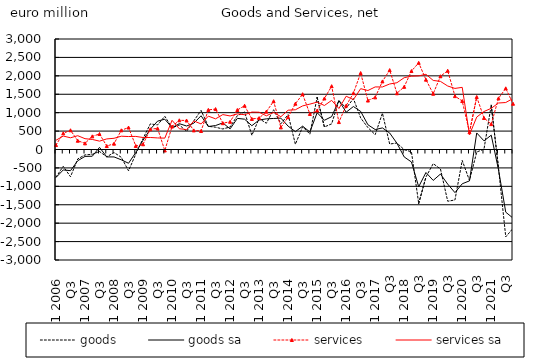
| Category | goods | goods sa | services | services sa |
|---|---|---|---|---|
| Q1 2006 | -748.738 | -760.381 | 121.483 | 251.205 |
| Q2  | -457.13 | -554.307 | 439.864 | 365.201 |
| Q3  | -738.853 | -574.648 | 522.467 | 318.056 |
| Q4  | -255.445 | -304.223 | 238.126 | 374.832 |
| Q1 2007 | -146.668 | -187.906 | 167.038 | 293.831 |
| Q2  | -131.911 | -182.819 | 357.186 | 272.807 |
| Q3  | -54.109 | 58.105 | 420.496 | 227.367 |
| Q4  | -199.637 | -201.16 | 93.568 | 287.261 |
| Q1 2008 | -81.525 | -201.568 | 157.959 | 304.399 |
| Q2  | -212.023 | -280.312 | 520.771 | 360.694 |
| Q3  | -578.77 | -373.701 | 596.514 | 351.851 |
| Q4  | -123.601 | -80.755 | 96.329 | 355.462 |
| Q1 2009 | 296.348 | 253.201 | 142.739 | 325.169 |
| Q2  | 694.756 | 549.918 | 550.029 | 326.335 |
| Q3  | 667.255 | 769.571 | 573.279 | 314.305 |
| Q4  | 903.09 | 822.598 | -26.654 | 308.787 |
| Q1 2010 | 586.597 | 591.472 | 623.552 | 792.014 |
| Q2  | 666.429 | 701.182 | 792.951 | 564 |
| Q3  | 493.636 | 638.366 | 787.632 | 540.513 |
| Q4  | 777.694 | 714.006 | 518.483 | 775.29 |
| Q1 2011 | 1061.507 | 915.73 | 502.35 | 694.013 |
| Q2  | 629.698 | 623.226 | 1075.429 | 905.614 |
| Q3  | 604.538 | 651.03 | 1097.459 | 832.543 |
| Q4  | 557.456 | 722.274 | 714.594 | 947.695 |
| Q1 2012 | 611.21 | 559.59 | 752.437 | 910.64 |
| Q2  | 919.092 | 845.407 | 1073.312 | 966.636 |
| Q3  | 1016.702 | 822.878 | 1187.924 | 944.221 |
| Q4  | 385.656 | 646.075 | 829.883 | 1016.22 |
| Q1 2013 | 840.395 | 800.399 | 852.505 | 1012.325 |
| Q2  | 713.466 | 832.137 | 1027.945 | 914.969 |
| Q3  | 1078.77 | 842.679 | 1310.987 | 1006.77 |
| Q4  | 698.464 | 851.746 | 600.682 | 890.362 |
| Q1 2014 | 946.76 | 633.575 | 878.495 | 1066.539 |
| Q2  | 141.9 | 485.284 | 1243.117 | 1078.867 |
| Q3  | 617.394 | 633.753 | 1501.271 | 1183.689 |
| Q4  | 419.131 | 475.713 | 964.238 | 1232.092 |
| Q1 2015 | 1413.787 | 999.099 | 1057.718 | 1285.853 |
| Q2  | 611.78 | 793.43 | 1385.478 | 1194.489 |
| Q3  | 696.421 | 891.336 | 1719.273 | 1333.868 |
| Q4 | 1329.692 | 1329.569 | 744.866 | 1113.038 |
| Q1 2016 | 1124.371 | 1012.436 | 1191.804 | 1446.322 |
| Q2  | 1382.591 | 1166.267 | 1528.848 | 1355.096 |
| Q3  | 856.491 | 1034.344 | 2075.772 | 1651.624 |
| Q4 | 594.804 | 672.006 | 1329.107 | 1601.343 |
| Q1 2017 | 401.951 | 541.411 | 1415.299 | 1698.88 |
| Q2  | 985.323 | 585.867 | 1848.94 | 1697.861 |
| Q3 | 147.613 | 447.619 | 2155.803 | 1778.492 |
| Q4 | 177.128 | 170.385 | 1526.527 | 1813.059 |
| Q1 2018 | -5.41 | -201.919 | 1701.424 | 1949.306 |
| Q2  | -62.767 | -339.102 | 2130.129 | 1990.906 |
| Q3 | -1465.292 | -1011.507 | 2352.405 | 1999.143 |
| Q4 | -746.527 | -624.594 | 1895.973 | 2041.301 |
| Q1 2019 | -383.882 | -838.808 | 1513.848 | 1875.011 |
| Q2  | -528.384 | -666.012 | 1988.581 | 1848.86 |
| Q3 | -1404.377 | -939.859 | 2138.282 | 1723.672 |
| Q4 | -1370.259 | -1170.962 | 1449.146 | 1658.451 |
| Q1 2020 | -297.004 | -930.998 | 1315.74 | 1687.157 |
| Q2  | -842.21 | -851.61 | 468.967 | 401.5 |
| Q3 | -68.464 | 448.898 | 1426.038 | 880.36 |
| Q4 | 9.247 | 234.964 | 856.736 | 1031.615 |
| Q1 2021 | 1201.738 | 389.027 | 689.046 | 1117.528 |
| Q2  | -499.168 | -548.374 | 1388.417 | 1262.337 |
| Q3 | -2371.205 | -1701.68 | 1660.907 | 1275.43 |
| Q4 | -2142.059 | -1862.292 | 1242.744 | 1384.483 |